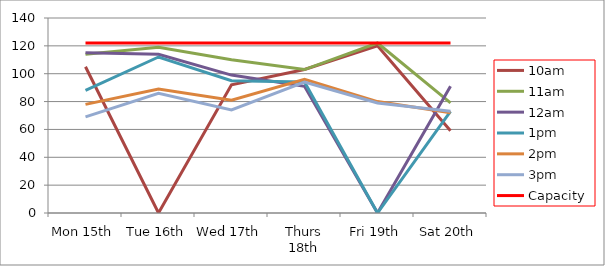
| Category | 9am | 10am | 11am | 12am | 1pm | 2pm | 3pm | 4pm | 5pm | Capacity |
|---|---|---|---|---|---|---|---|---|---|---|
| Mon 15th |  | 105 | 114 | 115 | 88 | 78 | 69 |  |  | 122 |
| Tue 16th |  | 0 | 119 | 114 | 112 | 89 | 86 |  |  | 122 |
| Wed 17th |  | 92 | 110 | 99 | 95 | 81 | 74 |  |  | 122 |
| Thurs 18th |  | 103 | 103 | 91 | 94 | 96 | 94 |  |  | 122 |
| Fri 19th |  | 120 | 122 | 0 | 0 | 80 | 79 |  |  | 122 |
| Sat 20th |  | 59 | 79 | 91 | 73 | 72 | 73 |  |  | 122 |